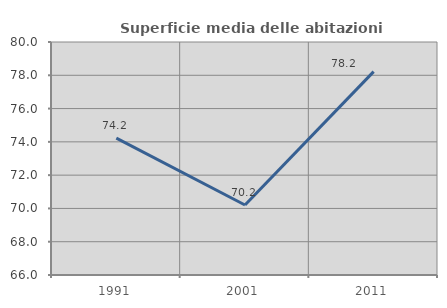
| Category | Superficie media delle abitazioni occupate |
|---|---|
| 1991.0 | 74.228 |
| 2001.0 | 70.208 |
| 2011.0 | 78.218 |